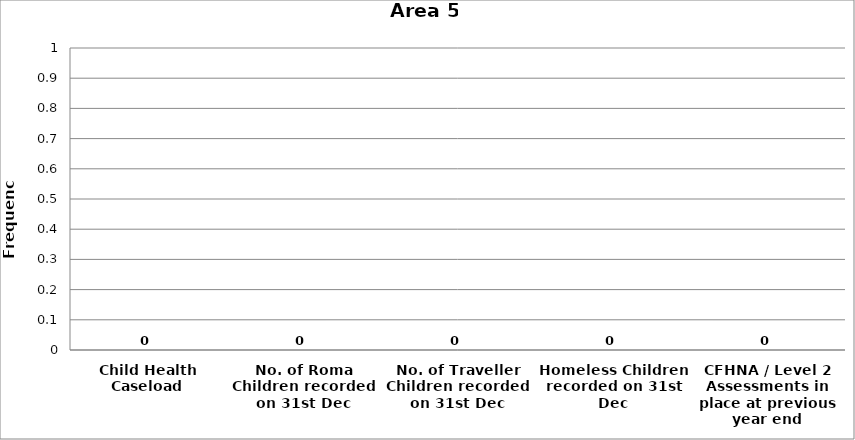
| Category | Area 5 |
|---|---|
| Child Health Caseload | 0 |
| No. of Roma Children recorded on 31st Dec | 0 |
| No. of Traveller Children recorded on 31st Dec | 0 |
| Homeless Children recorded on 31st Dec | 0 |
| CFHNA / Level 2 Assessments in place at previous year end | 0 |